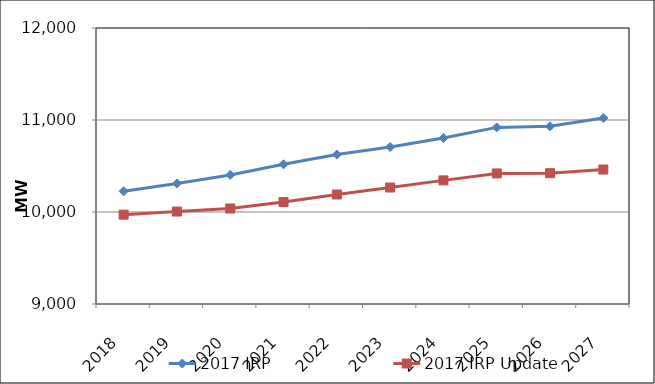
| Category | 2017 IRP | 2017 IRP Update |
|---|---|---|
| 2018.0 | 10224.713 | 9971.165 |
| 2019.0 | 10310.015 | 10005.039 |
| 2020.0 | 10403.218 | 10038.177 |
| 2021.0 | 10518.418 | 10109.048 |
| 2022.0 | 10624.16 | 10190.309 |
| 2023.0 | 10706.388 | 10266.289 |
| 2024.0 | 10804.439 | 10343.631 |
| 2025.0 | 10919.631 | 10419.182 |
| 2026.0 | 10931.281 | 10422.136 |
| 2027.0 | 11020.808 | 10461.772 |